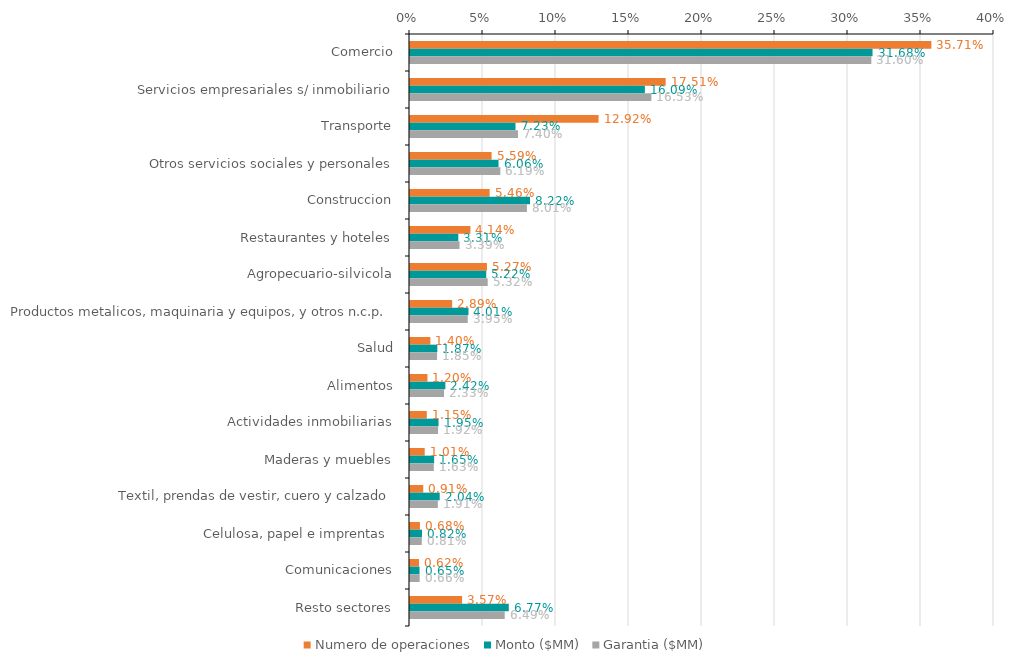
| Category | Numero de operaciones | Monto ($MM) | Garantia ($MM) |
|---|---|---|---|
| Comercio | 0.357 | 0.317 | 0.316 |
| Servicios empresariales s/ inmobiliario | 0.175 | 0.161 | 0.165 |
| Transporte | 0.129 | 0.072 | 0.074 |
| Otros servicios sociales y personales | 0.056 | 0.061 | 0.062 |
| Construccion | 0.055 | 0.082 | 0.08 |
| Restaurantes y hoteles | 0.041 | 0.033 | 0.034 |
| Agropecuario-silvicola | 0.053 | 0.052 | 0.053 |
| Productos metalicos, maquinaria y equipos, y otros n.c.p. | 0.029 | 0.04 | 0.04 |
| Salud | 0.014 | 0.019 | 0.019 |
| Alimentos | 0.012 | 0.024 | 0.023 |
| Actividades inmobiliarias | 0.012 | 0.02 | 0.019 |
| Maderas y muebles | 0.01 | 0.017 | 0.016 |
| Textil, prendas de vestir, cuero y calzado | 0.009 | 0.02 | 0.019 |
| Celulosa, papel e imprentas  | 0.007 | 0.008 | 0.008 |
| Comunicaciones | 0.006 | 0.007 | 0.007 |
| Resto sectores | 0.036 | 0.068 | 0.065 |